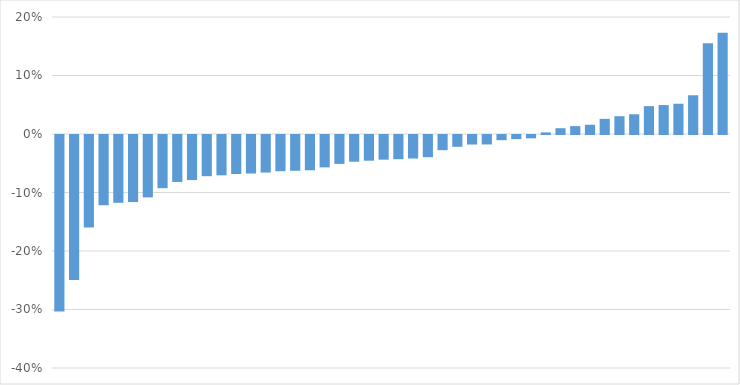
| Category | Series 0 |
|---|---|
| 0 | -0.302 |
| 1 | -0.248 |
| 2 | -0.158 |
| 3 | -0.12 |
| 4 | -0.116 |
| 5 | -0.115 |
| 6 | -0.107 |
| 7 | -0.091 |
| 8 | -0.08 |
| 9 | -0.077 |
| 10 | -0.07 |
| 11 | -0.069 |
| 12 | -0.067 |
| 13 | -0.066 |
| 14 | -0.064 |
| 15 | -0.062 |
| 16 | -0.061 |
| 17 | -0.06 |
| 18 | -0.055 |
| 19 | -0.049 |
| 20 | -0.046 |
| 21 | -0.044 |
| 22 | -0.042 |
| 23 | -0.041 |
| 24 | -0.04 |
| 25 | -0.038 |
| 26 | -0.026 |
| 27 | -0.02 |
| 28 | -0.016 |
| 29 | -0.016 |
| 30 | -0.009 |
| 31 | -0.007 |
| 32 | -0.006 |
| 33 | 0.003 |
| 34 | 0.01 |
| 35 | 0.014 |
| 36 | 0.016 |
| 37 | 0.026 |
| 38 | 0.03 |
| 39 | 0.034 |
| 40 | 0.048 |
| 41 | 0.049 |
| 42 | 0.052 |
| 43 | 0.066 |
| 44 | 0.155 |
| 45 | 0.173 |